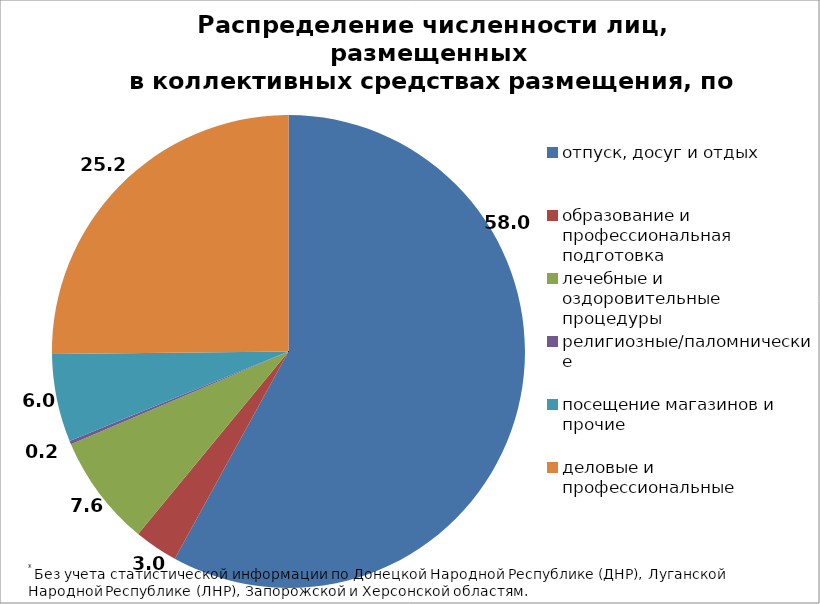
| Category | Series 0 |
|---|---|
| отпуск, досуг и отдых | 57.984 |
| образование и профессиональная  подготовка | 2.985 |
| лечебные и оздоровительные  процедуры | 7.619 |
| религиозные/паломнические  | 0.24 |
| посещение магазинов и прочие | 6.005 |
| деловые и профессиональные | 25.168 |